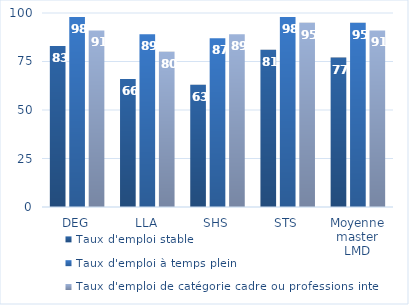
| Category | Taux d'emploi stable | Taux d'emploi à temps plein | Taux d'emploi de catégorie cadre ou professions intermédiaires |
|---|---|---|---|
| DEG | 83 | 98 | 91 |
| LLA | 66 | 89 | 80 |
| SHS | 63 | 87 | 89 |
| STS | 81 | 98 | 95 |
| Moyenne master LMD | 77 | 95 | 91 |